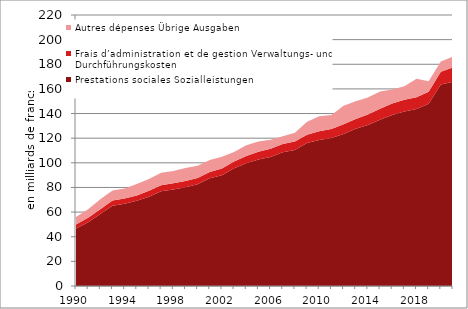
| Category | Prestations sociales | Frais d’administration et de gestion | Autres dépenses |
|---|---|---|---|
| 1990.0 | 46.642 | 3.247 | 6.122 |
| 1991.0 | 51.724 | 3.602 | 7.035 |
| 1992.0 | 58.363 | 3.857 | 8.103 |
| 1993.0 | 65.237 | 4.22 | 8.085 |
| 1994.0 | 66.67 | 4.317 | 8.215 |
| 1995.0 | 69.138 | 4.426 | 9.192 |
| 1996.0 | 72.437 | 4.797 | 9.56 |
| 1997.0 | 76.99 | 4.883 | 10.006 |
| 1998.0 | 78.357 | 5.092 | 9.958 |
| 1999.0 | 80.212 | 5.077 | 10.513 |
| 2000.0 | 82.616 | 5.015 | 9.936 |
| 2001.0 | 87.471 | 5.131 | 9.758 |
| 2002.0 | 89.99 | 5.409 | 9.514 |
| 2003.0 | 95.575 | 5.538 | 7.608 |
| 2004.0 | 99.675 | 5.814 | 8.741 |
| 2005.0 | 102.753 | 6.23 | 8.388 |
| 2006.0 | 104.818 | 6.612 | 7.283 |
| 2007.0 | 108.552 | 6.804 | 6.306 |
| 2008.0 | 110.485 | 6.753 | 7.169 |
| 2009.0 | 116.053 | 6.75 | 10.634 |
| 2010.0 | 118.569 | 7.073 | 12.2 |
| 2011.0 | 120.136 | 7.27 | 11.328 |
| 2012.0 | 123.484 | 7.784 | 15.013 |
| 2013.0 | 127.666 | 7.839 | 14.457 |
| 2014.0 | 130.663 | 8.572 | 13.704 |
| 2015.0 | 134.912 | 8.901 | 14.001 |
| 2016.0 | 138.764 | 9.316 | 11.473 |
| 2017.0 | 141.758 | 9.393 | 11.1 |
| 2018.0 | 143.609 | 9.549 | 15.119 |
| 2019.0 | 147.901 | 9.829 | 8.465 |
| 2020.0 | 163.579 | 10.299 | 8.416 |
| 2021.0 | 165.889 | 11.603 | 8.694 |